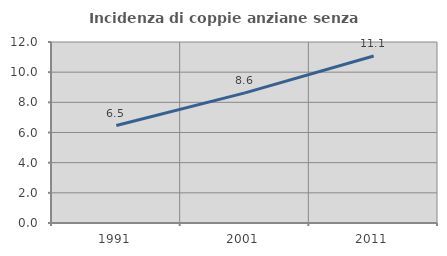
| Category | Incidenza di coppie anziane senza figli  |
|---|---|
| 1991.0 | 6.459 |
| 2001.0 | 8.63 |
| 2011.0 | 11.069 |